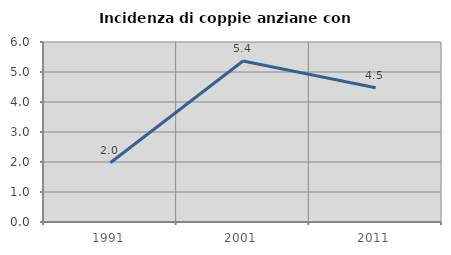
| Category | Incidenza di coppie anziane con figli |
|---|---|
| 1991.0 | 1.975 |
| 2001.0 | 5.367 |
| 2011.0 | 4.478 |